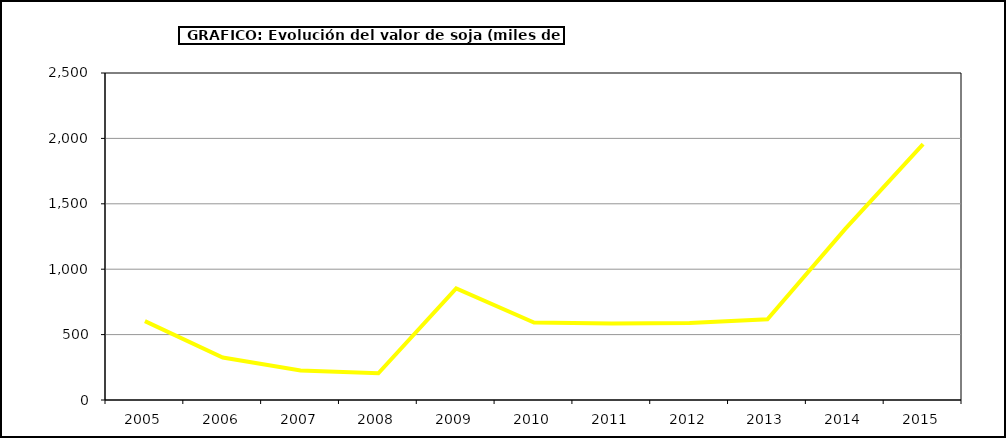
| Category | Valor |
|---|---|
| 2005.0 | 602.754 |
| 2006.0 | 324.61 |
| 2007.0 | 225.216 |
| 2008.0 | 204.204 |
| 2009.0 | 853.62 |
| 2010.0 | 592.162 |
| 2011.0 | 584.814 |
| 2012.0 | 588.253 |
| 2013.0 | 616.743 |
| 2014.0 | 1308.04 |
| 2015.0 | 1956 |